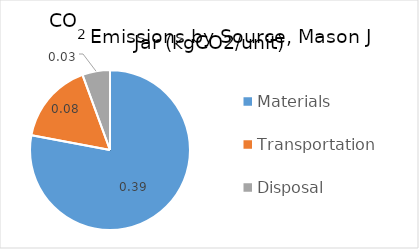
| Category | Series 0 |
|---|---|
| Materials | 0.388 |
| Transportation | 0.082 |
| Disposal | 0.028 |